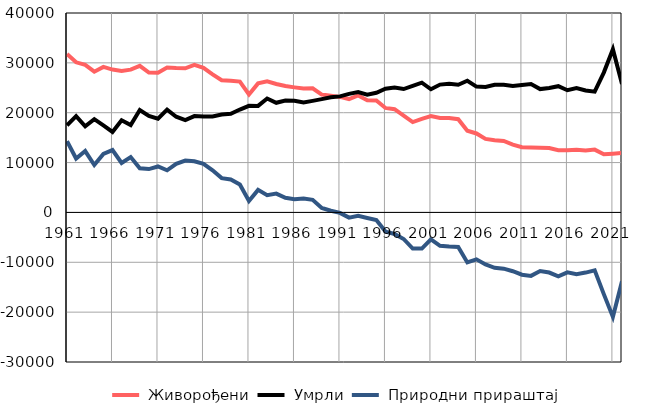
| Category |  Живорођени |  Умрли |  Природни прираштај |
|---|---|---|---|
| 1961.0 | 31763 | 17480 | 14283 |
| 1962.0 | 30112 | 19305 | 10807 |
| 1963.0 | 29589 | 17276 | 12313 |
| 1964.0 | 28223 | 18710 | 9513 |
| 1965.0 | 29183 | 17457 | 11726 |
| 1966.0 | 28653 | 16151 | 12502 |
| 1967.0 | 28393 | 18478 | 9915 |
| 1968.0 | 28644 | 17536 | 11108 |
| 1969.0 | 29392 | 20536 | 8856 |
| 1970.0 | 28042 | 19343 | 8699 |
| 1971.0 | 28012 | 18795 | 9217 |
| 1972.0 | 29075 | 20620 | 8455 |
| 1973.0 | 28948 | 19191 | 9757 |
| 1974.0 | 28913 | 18521 | 10392 |
| 1975.0 | 29587 | 19321 | 10266 |
| 1976.0 | 28985 | 19226 | 9759 |
| 1977.0 | 27692 | 19239 | 8453 |
| 1978.0 | 26511 | 19629 | 6882 |
| 1979.0 | 26402 | 19781 | 6621 |
| 1980.0 | 26239 | 20636 | 5603 |
| 1981.0 | 23672 | 21388 | 2284 |
| 1982.0 | 25887 | 21366 | 4521 |
| 1983.0 | 26313 | 22842 | 3471 |
| 1984.0 | 25759 | 21991 | 3768 |
| 1985.0 | 25352 | 22428 | 2924 |
| 1986.0 | 25078 | 22416 | 2662 |
| 1987.0 | 24838 | 22063 | 2775 |
| 1988.0 | 24906 | 22377 | 2529 |
| 1989.0 | 23631 | 22728 | 903 |
| 1990.0 | 23427 | 23081 | 346 |
| 1991.0 | 23172 | 23272 | -100 |
| 1992.0 | 22739 | 23785 | -1046 |
| 1993.0 | 23451 | 24147 | -696 |
| 1994.0 | 22501 | 23615 | -1114 |
| 1995.0 | 22469 | 24006 | -1537 |
| 1996.0 | 20953 | 24799 | -3846 |
| 1997.0 | 20713 | 25037 | -4324 |
| 1998.0 | 19421 | 24748 | -5327 |
| 1999.0 | 18121 | 25379 | -7258 |
| 2000.0 | 18769 | 26028 | -7259 |
| 2001.0 | 19314 | 24700 | -5386 |
| 2002.0 | 18935 | 25640 | -6705 |
| 2003.0 | 18937 | 25788 | -6851 |
| 2004.0 | 18700 | 25615 | -6915 |
| 2005.0 | 16378 | 26408 | -10030 |
| 2006.0 | 15837 | 25241 | -9404 |
| 2007.0 | 14745 | 25170 | -10425 |
| 2008.0 | 14483 | 25591 | -11108 |
| 2009.0 | 14328 | 25607 | -11279 |
| 2010.0 | 13592 | 25384 | -11792 |
| 2011.0 | 13072 | 25567 | -12495 |
| 2012.0 | 13032 | 25757 | -12725 |
| 2013.0 | 12989 | 24739 | -11750 |
| 2014.0 | 12920 | 24977 | -12057 |
| 2015.0 | 12489 | 25320 | -12831 |
| 2016.0 | 12492 | 24509 | -12017 |
| 2017.0 | 12587 | 24958 | -12371 |
| 2018.0 | 12400 | 24468 | -12068 |
| 2019.0 | 12599 | 24222 | -11623 |
| 2020.0 | 11657 | 28048 | -16391 |
| 2021.0 | 11789 | 32745 | -20956 |
| 2022.0 | 11949 | 25763 | -13814 |